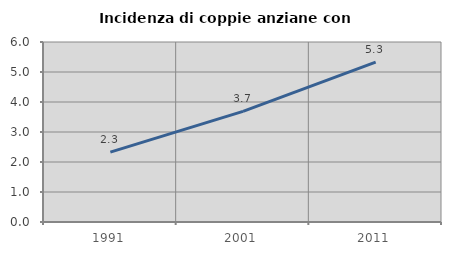
| Category | Incidenza di coppie anziane con figli |
|---|---|
| 1991.0 | 2.327 |
| 2001.0 | 3.688 |
| 2011.0 | 5.329 |